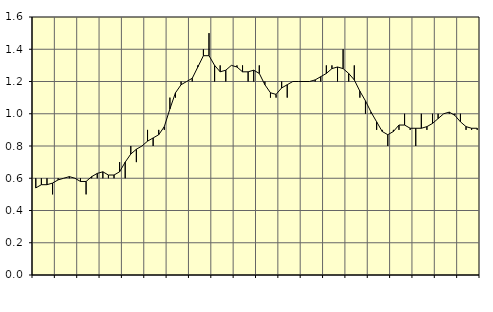
| Category | Piggar | Fast anställda utomlands |
|---|---|---|
| nan | 0.6 | 0.54 |
| 1.0 | 0.6 | 0.56 |
| 1.0 | 0.6 | 0.56 |
| 1.0 | 0.5 | 0.57 |
| nan | 0.6 | 0.59 |
| 2.0 | 0.6 | 0.6 |
| 2.0 | 0.6 | 0.61 |
| 2.0 | 0.6 | 0.6 |
| nan | 0.6 | 0.58 |
| 3.0 | 0.5 | 0.58 |
| 3.0 | 0.6 | 0.61 |
| 3.0 | 0.6 | 0.63 |
| nan | 0.6 | 0.64 |
| 4.0 | 0.6 | 0.62 |
| 4.0 | 0.6 | 0.62 |
| 4.0 | 0.7 | 0.64 |
| nan | 0.6 | 0.7 |
| 5.0 | 0.8 | 0.75 |
| 5.0 | 0.7 | 0.78 |
| 5.0 | 0.8 | 0.8 |
| nan | 0.9 | 0.83 |
| 6.0 | 0.8 | 0.85 |
| 6.0 | 0.9 | 0.87 |
| 6.0 | 0.9 | 0.92 |
| nan | 1.1 | 1.03 |
| 7.0 | 1.1 | 1.13 |
| 7.0 | 1.2 | 1.18 |
| 7.0 | 1.2 | 1.2 |
| nan | 1.2 | 1.22 |
| 8.0 | 1.3 | 1.29 |
| 8.0 | 1.4 | 1.36 |
| 8.0 | 1.5 | 1.36 |
| nan | 1.2 | 1.3 |
| 9.0 | 1.3 | 1.26 |
| 9.0 | 1.2 | 1.27 |
| 9.0 | 1.3 | 1.3 |
| nan | 1.3 | 1.29 |
| 10.0 | 1.3 | 1.26 |
| 10.0 | 1.2 | 1.26 |
| 10.0 | 1.2 | 1.27 |
| nan | 1.3 | 1.25 |
| 11.0 | 1.2 | 1.18 |
| 11.0 | 1.1 | 1.13 |
| 11.0 | 1.1 | 1.12 |
| nan | 1.2 | 1.16 |
| 12.0 | 1.1 | 1.18 |
| 12.0 | 1.2 | 1.2 |
| 12.0 | 1.2 | 1.2 |
| nan | 1.2 | 1.2 |
| 13.0 | 1.2 | 1.2 |
| 13.0 | 1.2 | 1.21 |
| 13.0 | 1.2 | 1.23 |
| nan | 1.3 | 1.25 |
| 14.0 | 1.3 | 1.28 |
| 14.0 | 1.2 | 1.29 |
| 14.0 | 1.4 | 1.28 |
| nan | 1.2 | 1.25 |
| 15.0 | 1.3 | 1.21 |
| 15.0 | 1.1 | 1.14 |
| 15.0 | 1 | 1.08 |
| nan | 1 | 1.01 |
| 16.0 | 0.9 | 0.95 |
| 16.0 | 0.9 | 0.89 |
| 16.0 | 0.8 | 0.87 |
| nan | 0.9 | 0.89 |
| 17.0 | 0.9 | 0.93 |
| 17.0 | 1 | 0.93 |
| 17.0 | 0.9 | 0.91 |
| nan | 0.8 | 0.91 |
| 18.0 | 1 | 0.91 |
| 18.0 | 0.9 | 0.92 |
| 18.0 | 1 | 0.94 |
| nan | 1 | 0.97 |
| 19.0 | 1 | 1 |
| 19.0 | 1 | 1.01 |
| 19.0 | 1 | 0.99 |
| nan | 1 | 0.95 |
| 20.0 | 0.9 | 0.92 |
| 20.0 | 0.9 | 0.91 |
| 20.0 | 0.9 | 0.91 |